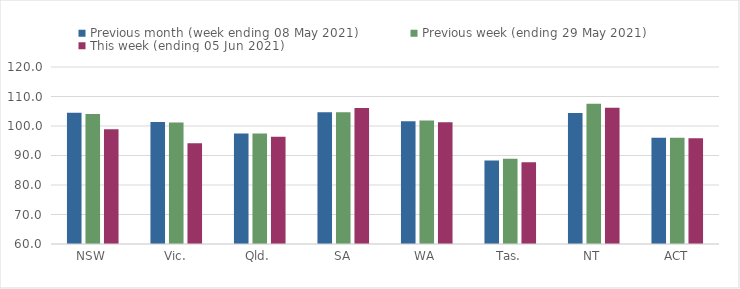
| Category | Previous month (week ending 08 May 2021) | Previous week (ending 29 May 2021) | This week (ending 05 Jun 2021) |
|---|---|---|---|
| NSW | 104.47 | 104.06 | 98.87 |
| Vic. | 101.37 | 101.21 | 94.16 |
| Qld. | 97.47 | 97.46 | 96.37 |
| SA | 104.63 | 104.64 | 106.09 |
| WA | 101.65 | 101.84 | 101.29 |
| Tas. | 88.32 | 88.91 | 87.67 |
| NT | 104.37 | 107.52 | 106.21 |
| ACT | 96 | 96 | 95.88 |